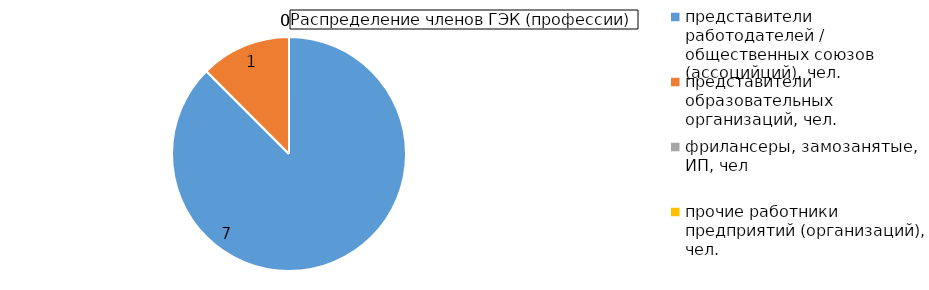
| Category | Series 1 |
|---|---|
| представители работодателей / общественных союзов (ассоцийций), чел. | 7 |
| представители образовательных организаций, чел. | 1 |
| фрилансеры, замозанятые, ИП, чел | 0 |
| прочие работники предприятий (организаций), чел. | 0 |